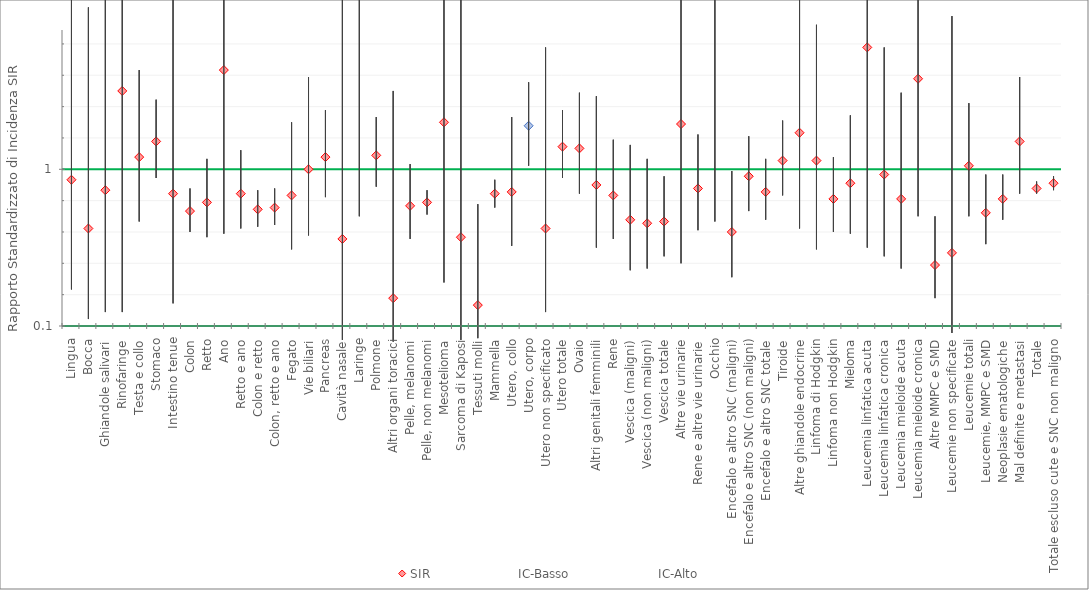
| Category | SIR | IC-Basso | IC-Alto |
|---|---|---|---|
| Lingua | 0.94 | 0.31 | 2.2 |
| Bocca | 0.66 | 0.14 | 1.93 |
| Ghiandole salivari | 0.88 | 0.18 | 2.59 |
| Rinofaringe | 1.45 | 0.18 | 5.22 |
| Testa e collo | 1.07 | 0.7 | 1.57 |
| Stomaco | 1.16 | 0.95 | 1.4 |
| Intestino tenue | 0.86 | 0.23 | 2.2 |
| Colon | 0.76 | 0.64 | 0.89 |
| Retto | 0.81 | 0.61 | 1.06 |
| Ano | 1.57 | 0.63 | 3.23 |
| Retto e ano | 0.86 | 0.66 | 1.11 |
| Colon e retto | 0.77 | 0.67 | 0.88 |
| Colon, retto e ano | 0.78 | 0.68 | 0.89 |
| Fegato | 0.85 | 0.54 | 1.27 |
| Vie biliari | 1 | 0.62 | 1.53 |
| Pancreas | 1.07 | 0.84 | 1.34 |
| Cavità nasale | 0.6 | 0.02 | 3.37 |
| Laringe | 1.81 | 0.73 | 3.73 |
| Polmone | 1.08 | 0.9 | 1.3 |
| Altri organi toracici | 0.26 | 0.01 | 1.45 |
| Pelle, melanomi | 0.79 | 0.6 | 1.03 |
| Pelle, non melanomi | 0.81 | 0.74 | 0.88 |
| Mesotelioma | 1.27 | 0.35 | 3.25 |
| Sarcoma di Kaposi | 0.61 | 0.02 | 3.39 |
| Tessuti molli | 0.22 | 0.03 | 0.8 |
| Mammella | 0.86 | 0.78 | 0.94 |
| Utero, collo | 0.87 | 0.56 | 1.3 |
| Utero, corpo | 1.25 | 1.02 | 1.5 |
| Utero non specificato | 0.66 | 0.18 | 1.7 |
| Utero totale | 1.13 | 0.95 | 1.34 |
| Ovaio | 1.12 | 0.86 | 1.44 |
| Altri genitali femminili | 0.91 | 0.55 | 1.42 |
| Rene | 0.85 | 0.6 | 1.17 |
| Vescica (maligni) | 0.71 | 0.42 | 1.14 |
| Vescica (non maligni) | 0.69 | 0.43 | 1.06 |
| Vescica totale | 0.7 | 0.5 | 0.96 |
| Altre vie urinarie | 1.26 | 0.46 | 2.74 |
| Rene e altre vie urinarie | 0.89 | 0.65 | 1.2 |
| Occhio | 2.14 | 0.7 | 5 |
| Encefalo e altro SNC (maligni) | 0.64 | 0.38 | 0.99 |
| Encefalo e altro SNC (non maligni) | 0.96 | 0.76 | 1.19 |
| Encefalo e altro SNC totale | 0.87 | 0.71 | 1.06 |
| Tiroide | 1.05 | 0.85 | 1.28 |
| Altre ghiandole endocrine | 1.21 | 0.66 | 2.03 |
| Linfoma di Hodgkin | 1.05 | 0.54 | 1.83 |
| Linfoma non Hodgkin | 0.83 | 0.64 | 1.07 |
| Mieloma | 0.92 | 0.63 | 1.31 |
| Leucemia linfatica acuta | 1.7 | 0.55 | 3.97 |
| Leucemia linfatica cronica | 0.97 | 0.5 | 1.7 |
| Leucemia mieloide acuta | 0.83 | 0.43 | 1.44 |
| Leucemia mieloide cronica | 1.52 | 0.73 | 2.79 |
| Altre MMPC e SMD | 0.45 | 0.26 | 0.73 |
| Leucemie non specificate | 0.52 | 0.06 | 1.88 |
| Leucemie totali | 1.02 | 0.73 | 1.38 |
| Leucemie, MMPC e SMD | 0.75 | 0.57 | 0.97 |
| Neoplasie ematologiche | 0.83 | 0.71 | 0.97 |
| Mal definite e metastasi | 1.16 | 0.86 | 1.53 |
| Totale | 0.89 | 0.86 | 0.93 |
| Totale escluso cute e SNC non maligno | 0.92 | 0.88 | 0.96 |